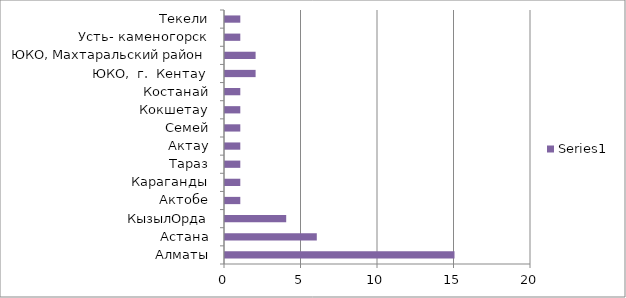
| Category | Series 0 |
|---|---|
| Алматы | 15 |
| Астана | 6 |
| КызылОрда | 4 |
| Актобе | 1 |
| Караганды | 1 |
| Тараз | 1 |
| Актау | 1 |
| Семей | 1 |
| Кокшетау | 1 |
| Костанай | 1 |
| ЮКО,  г.  Кентау | 2 |
| ЮКО, Махтаральский район | 2 |
| Усть- каменогорск | 1 |
| Текели | 1 |